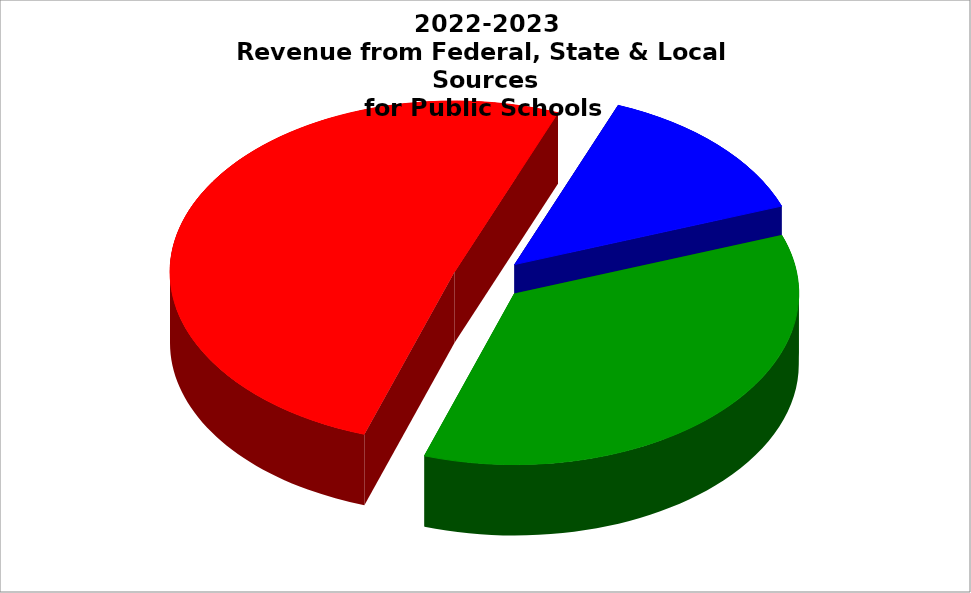
| Category | Series 0 |
|---|---|
| Total Local | 0.357 |
| Total State | 0.508 |
| Total Federal | 0.135 |